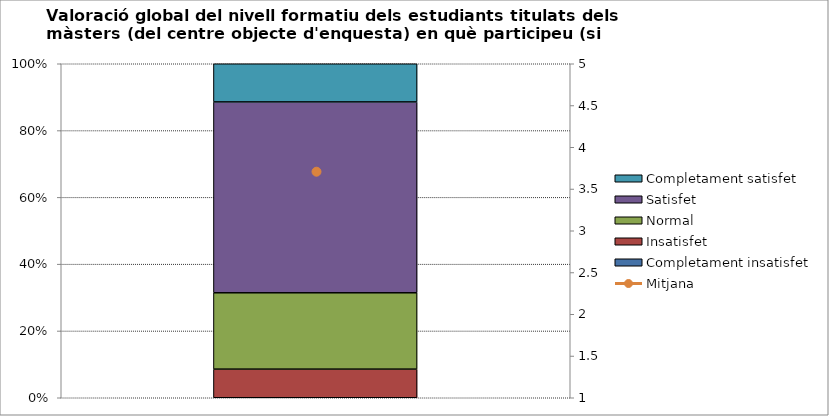
| Category | Completament insatisfet | Insatisfet | Normal | Satisfet | Completament satisfet |
|---|---|---|---|---|---|
|  | 0 | 3 | 8 | 20 | 4 |